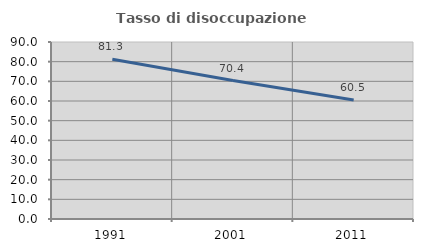
| Category | Tasso di disoccupazione giovanile  |
|---|---|
| 1991.0 | 81.262 |
| 2001.0 | 70.419 |
| 2011.0 | 60.495 |